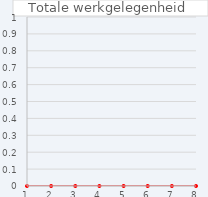
| Category | Series 0 |
|---|---|
| 1.0 | 0 |
| 2.0 | 0 |
| 3.0 | 0 |
| 4.0 | 0 |
| 5.0 | 0 |
| 6.0 | 0 |
| 7.0 | 0 |
| 8.0 | 0 |